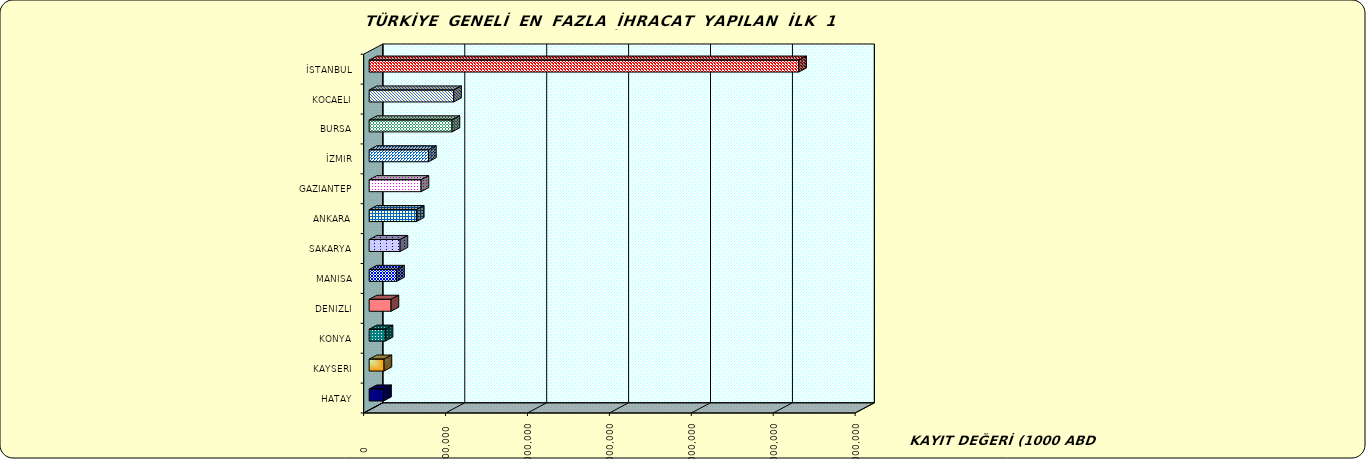
| Category | Series 0 |
|---|---|
| İSTANBUL | 26218673.133 |
| KOCAELI | 5159172.533 |
| BURSA | 5060078.017 |
| İZMIR | 3622986.943 |
| GAZIANTEP | 3170161.433 |
| ANKARA | 2883336.812 |
| SAKARYA | 1888163.562 |
| MANISA | 1678196.264 |
| DENIZLI | 1337215.112 |
| KONYA | 978081.454 |
| KAYSERI | 909526.31 |
| HATAY | 886152.751 |